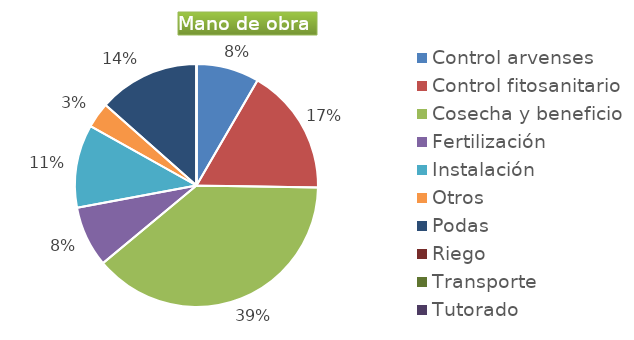
| Category | Series 0 |
|---|---|
| Control arvenses | 3676644 |
| Control fitosanitario | 7415604 |
| Cosecha y beneficio | 17012268 |
| Fertilización | 3552012 |
| Instalación | 4860648 |
| Otros | 1495584 |
| Podas | 5920020 |
| Riego | 0 |
| Transporte | 0 |
| Tutorado | 0 |